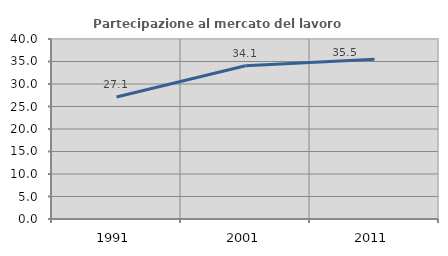
| Category | Partecipazione al mercato del lavoro  femminile |
|---|---|
| 1991.0 | 27.128 |
| 2001.0 | 34.054 |
| 2011.0 | 35.513 |